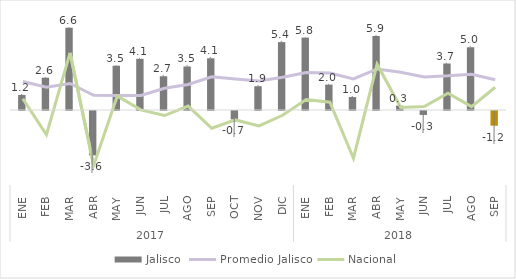
| Category | Jalisco |
|---|---|
| 0 | 1.206 |
| 1 | 2.583 |
| 2 | 6.582 |
| 3 | -3.552 |
| 4 | 3.541 |
| 5 | 4.092 |
| 6 | 2.701 |
| 7 | 3.482 |
| 8 | 4.137 |
| 9 | -0.676 |
| 10 | 1.902 |
| 11 | 5.43 |
| 12 | 5.791 |
| 13 | 2.032 |
| 14 | 1.036 |
| 15 | 5.92 |
| 16 | 0.349 |
| 17 | -0.317 |
| 18 | 3.72 |
| 19 | 5.019 |
| 20 | -1.177 |